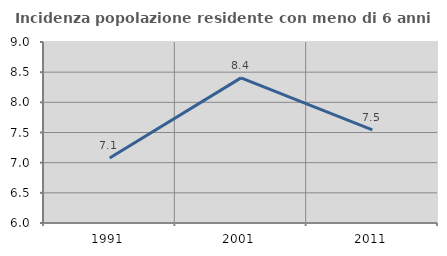
| Category | Incidenza popolazione residente con meno di 6 anni |
|---|---|
| 1991.0 | 7.077 |
| 2001.0 | 8.405 |
| 2011.0 | 7.545 |